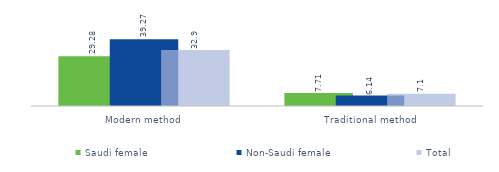
| Category | Saudi female  | Non-Saudi female | Total |
|---|---|---|---|
| Modern method | 29.28 | 39.273 | 32.9 |
| Traditional method | 7.708 | 6.14 | 7.14 |